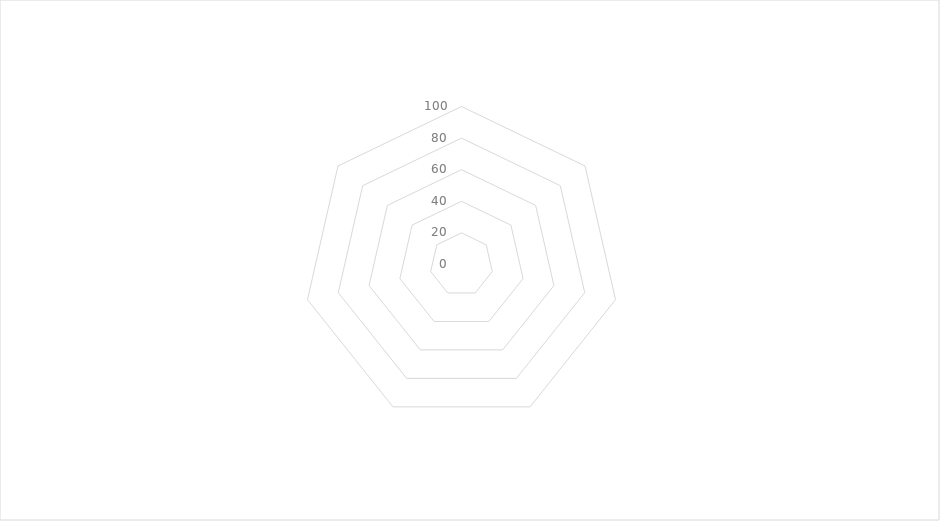
| Category | Résultats |
|---|---|
| Simple d'utilisation | 0 |
| Réparable adaptable modulable | 0 |
| Réutilisable et /ou longue durée de vie | 0 |
| Faible impact environnemental / Consommation | 0 |
| Ressources (RH, économiques …) | 0 |
| Abordable, accessible | 0 |
| Facilement fabricable | 0 |